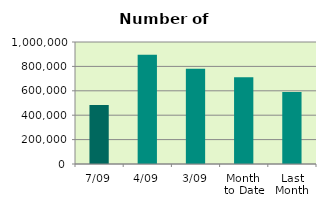
| Category | Series 0 |
|---|---|
| 7/09 | 484616 |
| 4/09 | 895558 |
| 3/09 | 779802 |
| Month 
to Date | 711902 |
| Last
Month | 590023.333 |